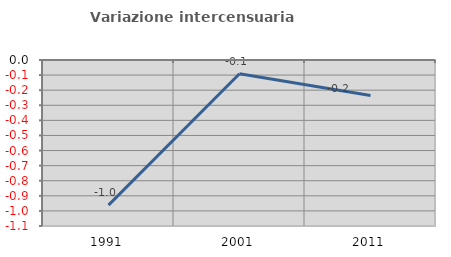
| Category | Variazione intercensuaria annua |
|---|---|
| 1991.0 | -0.962 |
| 2001.0 | -0.091 |
| 2011.0 | -0.236 |